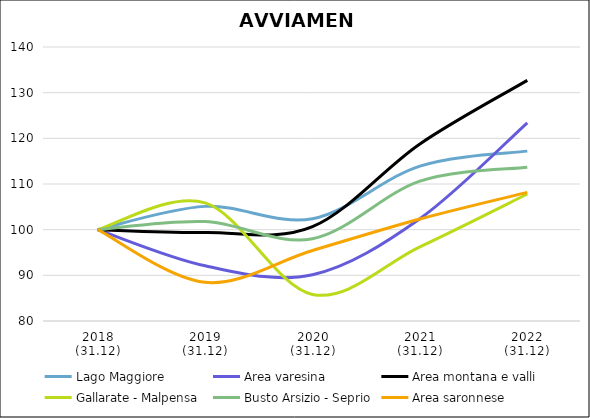
| Category | Lago Maggiore | Area varesina | Area montana e valli | Gallarate - Malpensa | Busto Arsizio - Seprio | Area saronnese |
|---|---|---|---|---|---|---|
| 2018
(31.12) | 100 | 100 | 100 | 100 | 100 | 100 |
| 2019
(31.12) | 105.1 | 92.098 | 99.38 | 105.865 | 101.768 | 88.46 |
| 2020
(31.12) | 102.392 | 90.136 | 100.658 | 85.808 | 98.027 | 95.445 |
| 2021
(31.12) | 113.929 | 102.408 | 118.784 | 96.252 | 110.619 | 102.338 |
| 2022
(31.12) | 117.2 | 123.402 | 132.688 | 107.805 | 113.681 | 108.169 |